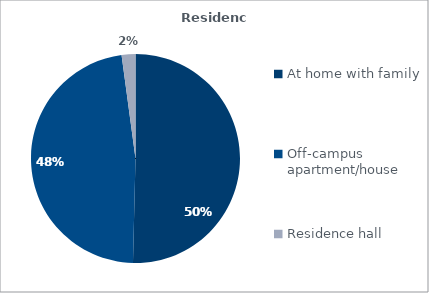
| Category | Series 0 |
|---|---|
| At home with family  | 0.501 |
| Off-campus apartment/house | 0.472 |
| Residence hall | 0.021 |